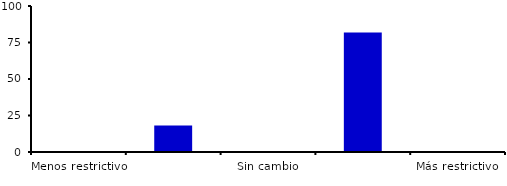
| Category | Series 0 |
|---|---|
| Menos restrictivo | 0 |
| Moderadamente menos restrictivo | 18.182 |
| Sin cambio | 0 |
| Moderadamente más restrictivo | 81.818 |
| Más restrictivo | 0 |